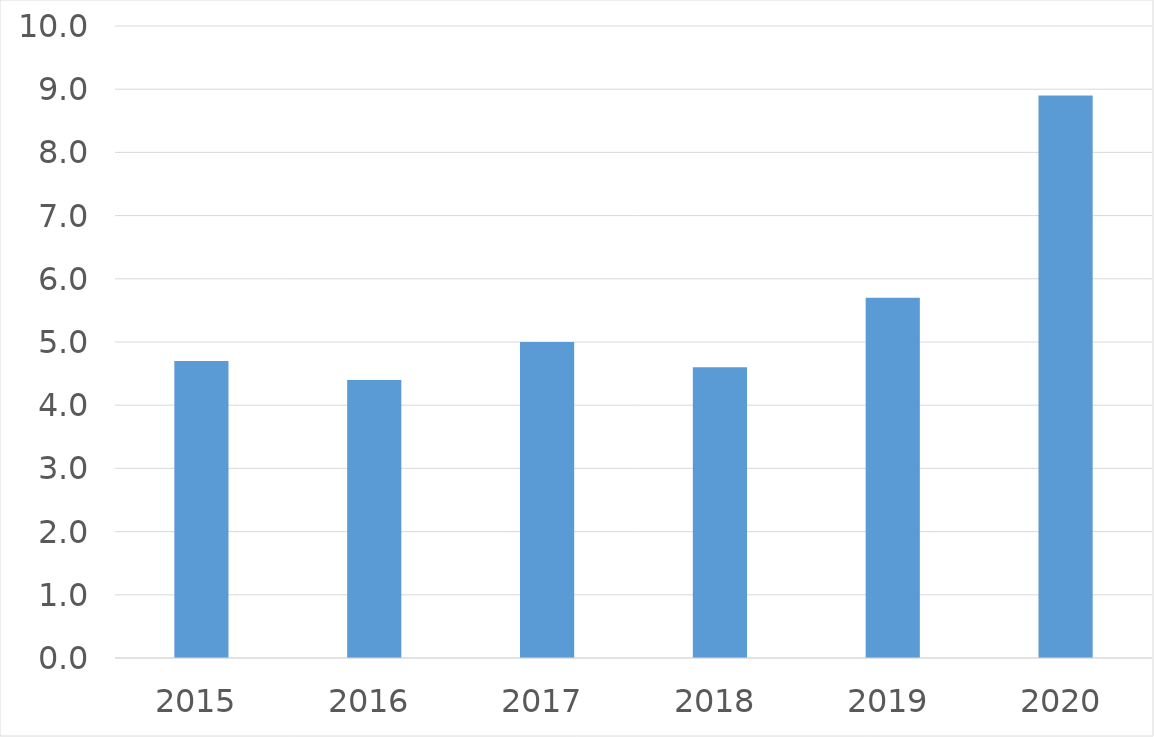
| Category | Series 0 |
|---|---|
| 2015 | 4.7 |
| 2016 | 4.4 |
| 2017 | 5 |
| 2018 | 4.6 |
| 2019 | 5.7 |
| 2020 | 8.9 |